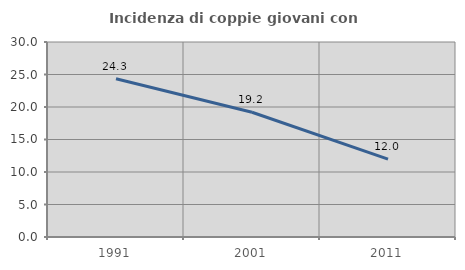
| Category | Incidenza di coppie giovani con figli |
|---|---|
| 1991.0 | 24.339 |
| 2001.0 | 19.187 |
| 2011.0 | 11.988 |